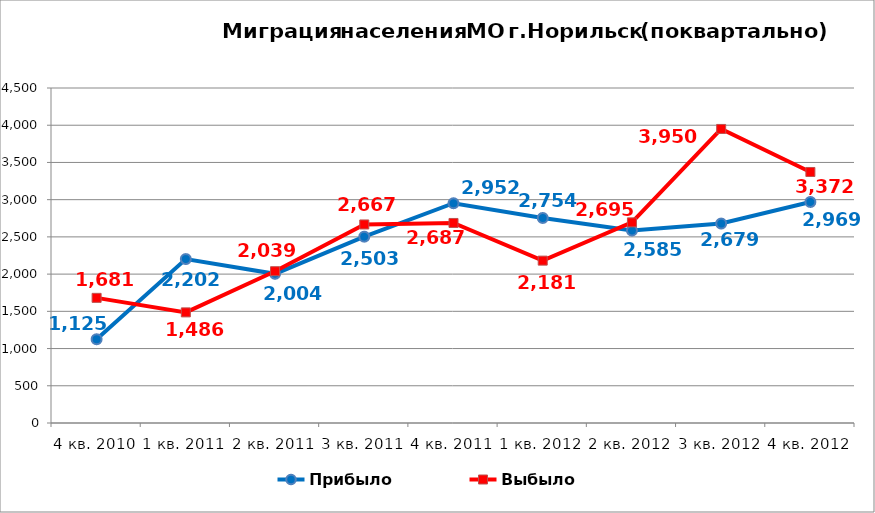
| Category | Прибыло | Выбыло |
|---|---|---|
| 4 кв. 2010 | 1125 | 1681 |
| 1 кв. 2011 | 2202 | 1486 |
| 2 кв. 2011 | 2004 | 2039 |
| 3 кв. 2011 | 2503 | 2667 |
| 4 кв. 2011 | 2952 | 2687 |
| 1 кв. 2012 | 2754 | 2181 |
| 2 кв. 2012 | 2585 | 2695 |
| 3 кв. 2012 | 2679 | 3950 |
| 4 кв. 2012 | 2969 | 3372 |